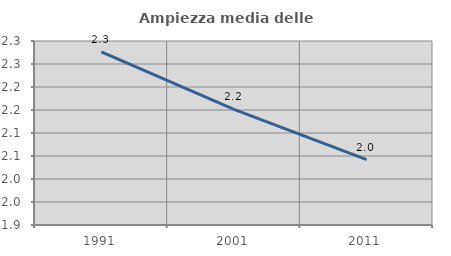
| Category | Ampiezza media delle famiglie |
|---|---|
| 1991.0 | 2.276 |
| 2001.0 | 2.151 |
| 2011.0 | 2.042 |